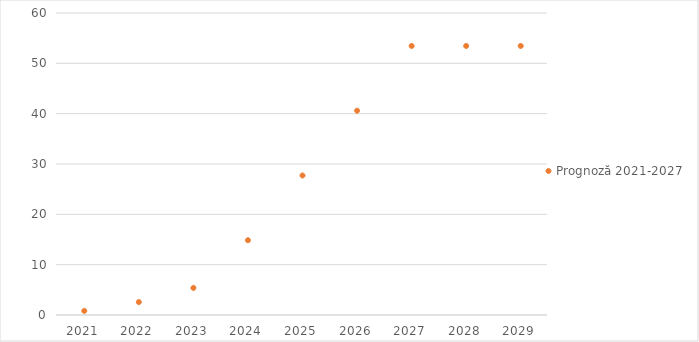
| Category | Prognoză 2021-2027 |
|---|---|
| 2021.0 | 0.819 |
| 2022.0 | 2.573 |
| 2023.0 | 5.381 |
| 2024.0 | 14.855 |
| 2025.0 | 27.721 |
| 2026.0 | 40.588 |
| 2027.0 | 53.454 |
| 2028.0 | 53.454 |
| 2029.0 | 53.454 |